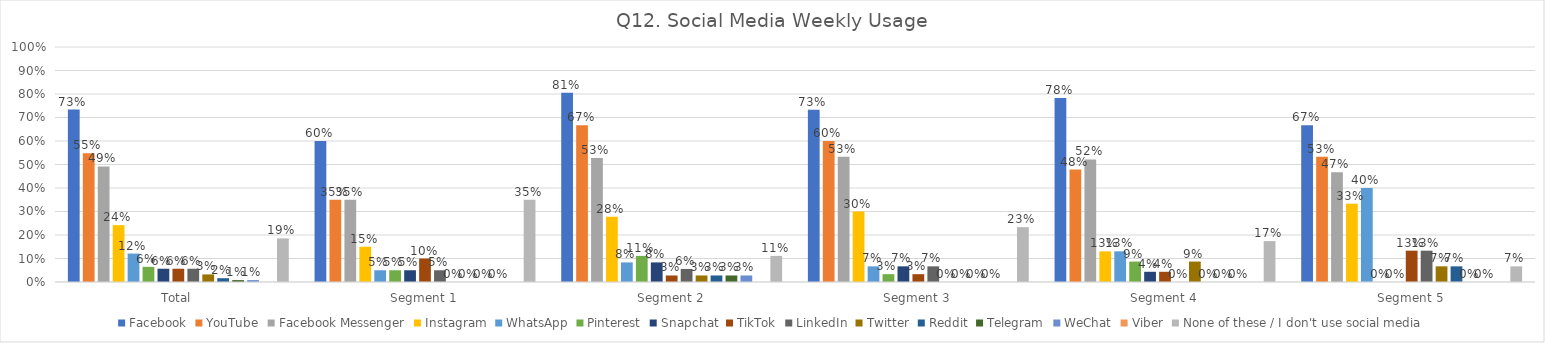
| Category | Facebook | YouTube | Facebook Messenger | Instagram | WhatsApp | Pinterest | Snapchat | TikTok | LinkedIn | Twitter | Reddit | Telegram | WeChat | Viber | None of these / I don't use social media |
|---|---|---|---|---|---|---|---|---|---|---|---|---|---|---|---|
| Total | 0.734 | 0.548 | 0.492 | 0.242 | 0.121 | 0.065 | 0.056 | 0.056 | 0.056 | 0.032 | 0.016 | 0.008 | 0.008 | 0 | 0.185 |
| Segment 1 | 0.6 | 0.35 | 0.35 | 0.15 | 0.05 | 0.05 | 0.05 | 0.1 | 0.05 | 0 | 0 | 0 | 0 | 0 | 0.35 |
| Segment 2 | 0.806 | 0.667 | 0.528 | 0.278 | 0.083 | 0.111 | 0.083 | 0.028 | 0.056 | 0.028 | 0.028 | 0.028 | 0.028 | 0 | 0.111 |
| Segment 3 | 0.733 | 0.6 | 0.533 | 0.3 | 0.067 | 0.033 | 0.067 | 0.033 | 0.067 | 0 | 0 | 0 | 0 | 0 | 0.233 |
| Segment 4 | 0.783 | 0.478 | 0.522 | 0.13 | 0.13 | 0.087 | 0.043 | 0.043 | 0 | 0.087 | 0 | 0 | 0 | 0 | 0.174 |
| Segment 5 | 0.667 | 0.533 | 0.467 | 0.333 | 0.4 | 0 | 0 | 0.133 | 0.133 | 0.067 | 0.067 | 0 | 0 | 0 | 0.067 |